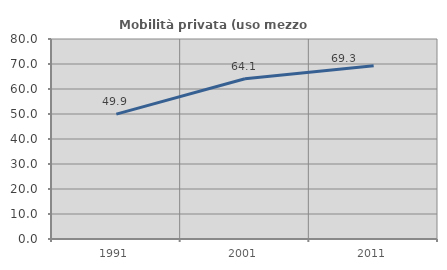
| Category | Mobilità privata (uso mezzo privato) |
|---|---|
| 1991.0 | 49.947 |
| 2001.0 | 64.124 |
| 2011.0 | 69.276 |